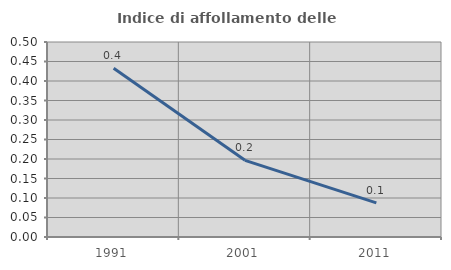
| Category | Indice di affollamento delle abitazioni  |
|---|---|
| 1991.0 | 0.432 |
| 2001.0 | 0.197 |
| 2011.0 | 0.087 |